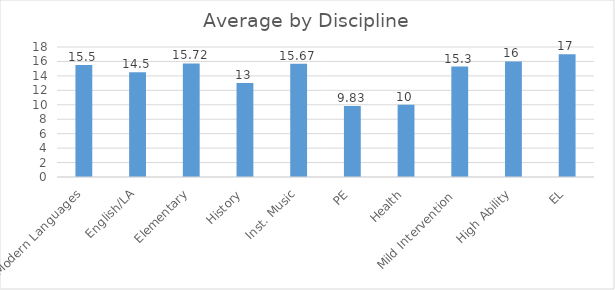
| Category | Average |
|---|---|
| Modern Languages | 15.5 |
| English/LA | 14.5 |
| Elementary | 15.72 |
| History | 13 |
| Inst. Music | 15.67 |
| PE | 9.83 |
| Health | 10 |
| Mild Intervention  | 15.3 |
| High Ability | 16 |
| EL | 17 |